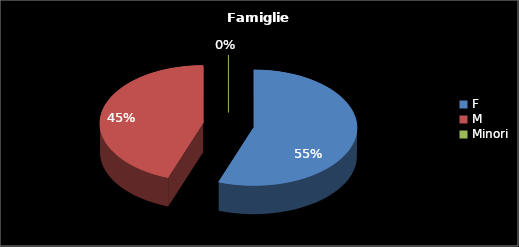
| Category | Series 0 |
|---|---|
| F | 106 |
| M | 85 |
| Minori | 0 |